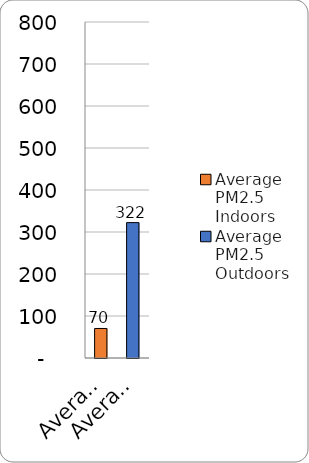
| Category | Series 0 |
|---|---|
| Average PM2.5 Indoors | 70.282 |
| Average PM2.5 Outdoors | 322.339 |